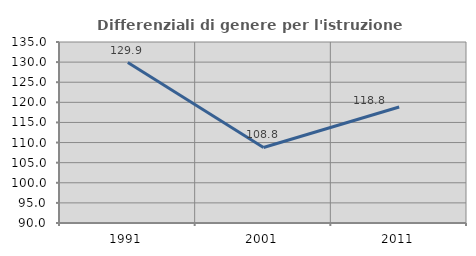
| Category | Differenziali di genere per l'istruzione superiore |
|---|---|
| 1991.0 | 129.888 |
| 2001.0 | 108.774 |
| 2011.0 | 118.837 |